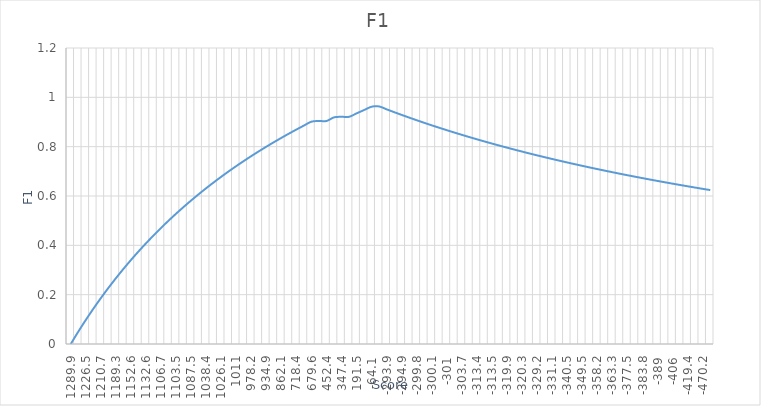
| Category | F1 |
|---|---|
| 1289.9 | 0 |
| 1249.0 | 0.05 |
| 1226.5 | 0.098 |
| 1211.8 | 0.143 |
| 1210.7 | 0.186 |
| 1204.7 | 0.227 |
| 1189.3 | 0.267 |
| 1171.2 | 0.304 |
| 1152.6 | 0.34 |
| 1146.9 | 0.375 |
| 1132.6 | 0.408 |
| 1110.6 | 0.44 |
| 1106.7 | 0.471 |
| 1105.4 | 0.5 |
| 1103.5 | 0.528 |
| 1087.7 | 0.556 |
| 1087.5 | 0.582 |
| 1065.8 | 0.607 |
| 1038.4 | 0.632 |
| 1035.1 | 0.655 |
| 1026.1 | 0.678 |
| 1019.1 | 0.7 |
| 1011.0 | 0.721 |
| 986.8 | 0.742 |
| 978.2 | 0.762 |
| 969.1 | 0.781 |
| 934.9 | 0.8 |
| 872.0 | 0.818 |
| 862.1 | 0.836 |
| 722.2 | 0.853 |
| 718.4 | 0.87 |
| 703.1 | 0.886 |
| 679.6 | 0.901 |
| 469.5 | 0.904 |
| 452.4 | 0.904 |
| 401.9 | 0.919 |
| 347.4 | 0.921 |
| 287.2 | 0.921 |
| 191.5 | 0.935 |
| 178.9 | 0.949 |
| -64.1 | 0.962 |
| -291.1 | 0.963 |
| -293.9 | 0.951 |
| -294.3 | 0.94 |
| -294.9 | 0.929 |
| -297.7 | 0.918 |
| -299.8 | 0.907 |
| -300.1 | 0.897 |
| -300.1 | 0.886 |
| -300.6 | 0.876 |
| -301.0 | 0.867 |
| -301.4 | 0.857 |
| -303.7 | 0.848 |
| -306.7 | 0.839 |
| -313.4 | 0.83 |
| -313.4 | 0.821 |
| -313.5 | 0.812 |
| -315.2 | 0.804 |
| -319.9 | 0.796 |
| -320.2 | 0.788 |
| -320.3 | 0.78 |
| -322.6 | 0.772 |
| -329.2 | 0.765 |
| -330.2 | 0.757 |
| -331.1 | 0.75 |
| -331.4 | 0.743 |
| -340.5 | 0.736 |
| -349.5 | 0.729 |
| -349.5 | 0.722 |
| -355.4 | 0.716 |
| -358.2 | 0.709 |
| -360.4 | 0.703 |
| -363.3 | 0.696 |
| -367.8 | 0.69 |
| -377.5 | 0.684 |
| -380.4 | 0.678 |
| -383.8 | 0.672 |
| -384.6 | 0.667 |
| -389.0 | 0.661 |
| -397.3 | 0.655 |
| -406.0 | 0.65 |
| -417.4 | 0.645 |
| -419.4 | 0.639 |
| -454.9 | 0.634 |
| -470.2 | 0.629 |
| -520.7 | 0.624 |